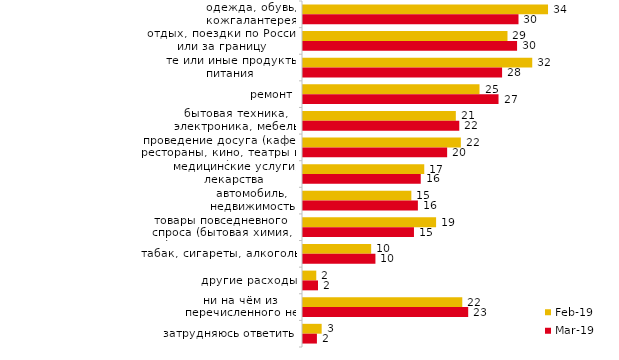
| Category | фев.19 | мар.19 |
|---|---|---|
| одежда, обувь, кожгалантерея | 34.15 | 30.035 |
| отдых, поездки по России или за границу | 28.5 | 29.836 |
| те или иные продукты питания | 31.95 | 27.747 |
| ремонт | 24.6 | 27.25 |
| бытовая техника, электроника, мебель | 21.3 | 21.78 |
| проведение досуга (кафе, рестораны, кино, театры и т.п.) | 22 | 20.09 |
| медицинские услуги, лекарства | 16.9 | 16.41 |
| автомобиль, недвижимость | 15.1 | 16.012 |
| товары повседневного спроса (бытовая химия, парфюмерно-косметические товары и т.д.) | 18.55 | 15.465 |
| табак, сигареты, алкоголь | 9.5 | 10.094 |
| другие расходы | 1.85 | 2.089 |
| ни на чём из перечисленного не экономили | 22.2 | 23.023 |
| затрудняюсь ответить | 2.6 | 1.939 |